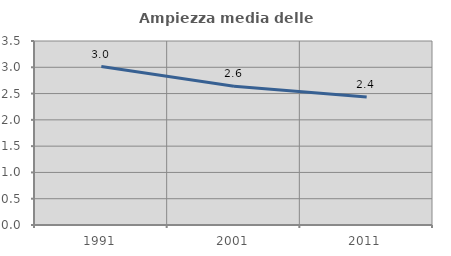
| Category | Ampiezza media delle famiglie |
|---|---|
| 1991.0 | 3.014 |
| 2001.0 | 2.641 |
| 2011.0 | 2.436 |